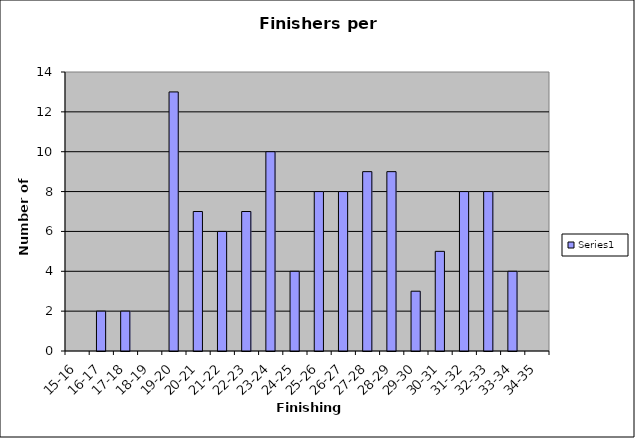
| Category | Series 0 |
|---|---|
| 15-16 | 0 |
| 16-17 | 2 |
| 17-18 | 2 |
| 18-19 | 0 |
| 19-20 | 13 |
| 20-21 | 7 |
| 21-22 | 6 |
| 22-23 | 7 |
| 23-24 | 10 |
| 24-25 | 4 |
| 25-26 | 8 |
| 26-27 | 8 |
| 27-28 | 9 |
| 28-29 | 9 |
| 29-30 | 3 |
| 30-31 | 5 |
| 31-32 | 8 |
| 32-33 | 8 |
| 33-34 | 4 |
| 34-35 | 0 |